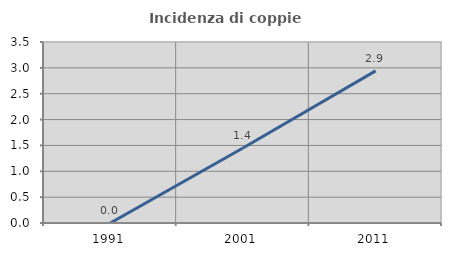
| Category | Incidenza di coppie miste |
|---|---|
| 1991.0 | 0 |
| 2001.0 | 1.449 |
| 2011.0 | 2.941 |